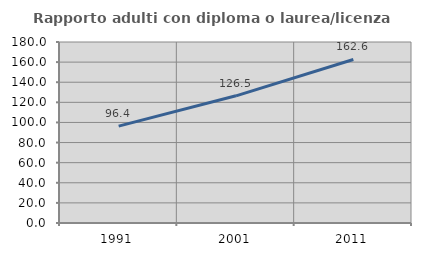
| Category | Rapporto adulti con diploma o laurea/licenza media  |
|---|---|
| 1991.0 | 96.377 |
| 2001.0 | 126.471 |
| 2011.0 | 162.626 |